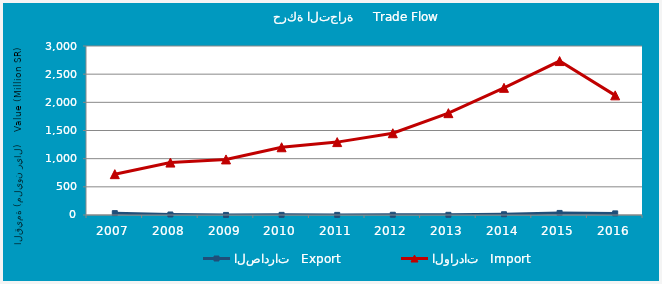
| Category | الصادرات   Export | الواردات   Import |
|---|---|---|
| 2007.0 | 33.205 | 724.844 |
| 2008.0 | 9.013 | 930.607 |
| 2009.0 | 1.315 | 986.492 |
| 2010.0 | 2.459 | 1202.656 |
| 2011.0 | 2.114 | 1293.961 |
| 2012.0 | 4.423 | 1451.209 |
| 2013.0 | 3.194 | 1807.615 |
| 2014.0 | 13.45 | 2257.369 |
| 2015.0 | 36.645 | 2732.469 |
| 2016.0 | 28.573 | 2123.836 |